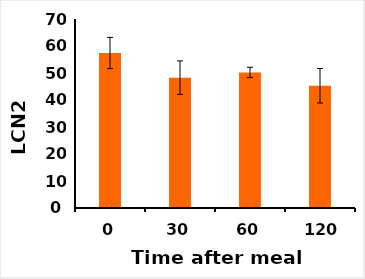
| Category | LCN2(ng/mL) |
|---|---|
| 0.0 | 57.407 |
| 30.0 | 48.283 |
| 60.0 | 50.197 |
| 120.0 | 45.277 |